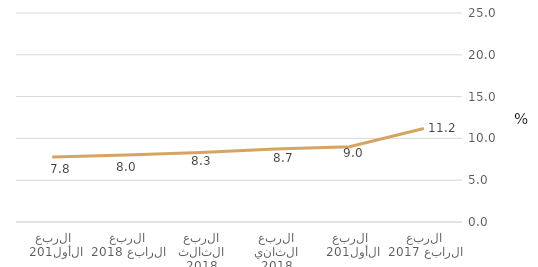
| Category | قطاع الأسر المعيشية |
|---|---|
| الربع الرابع 2017 | 11.193 |
| الربع الأول 2018 | 8.995 |
| الربع الثاني 2018 | 8.726 |
| الربع الثالث 2018 | 8.32 |
| الربع الرابع 2018 | 8.005 |
| الربع الأول 2019 | 7.764 |